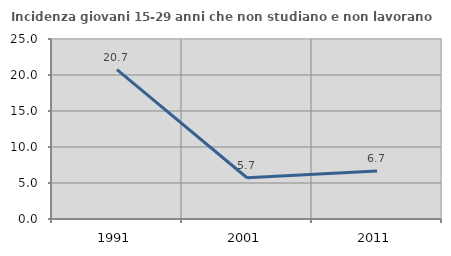
| Category | Incidenza giovani 15-29 anni che non studiano e non lavorano  |
|---|---|
| 1991.0 | 20.743 |
| 2001.0 | 5.725 |
| 2011.0 | 6.652 |